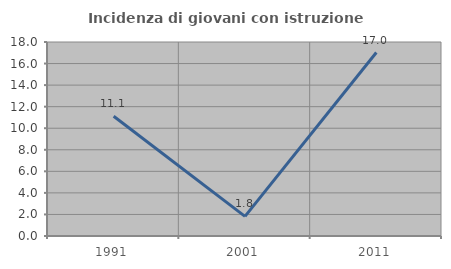
| Category | Incidenza di giovani con istruzione universitaria |
|---|---|
| 1991.0 | 11.111 |
| 2001.0 | 1.818 |
| 2011.0 | 17.021 |